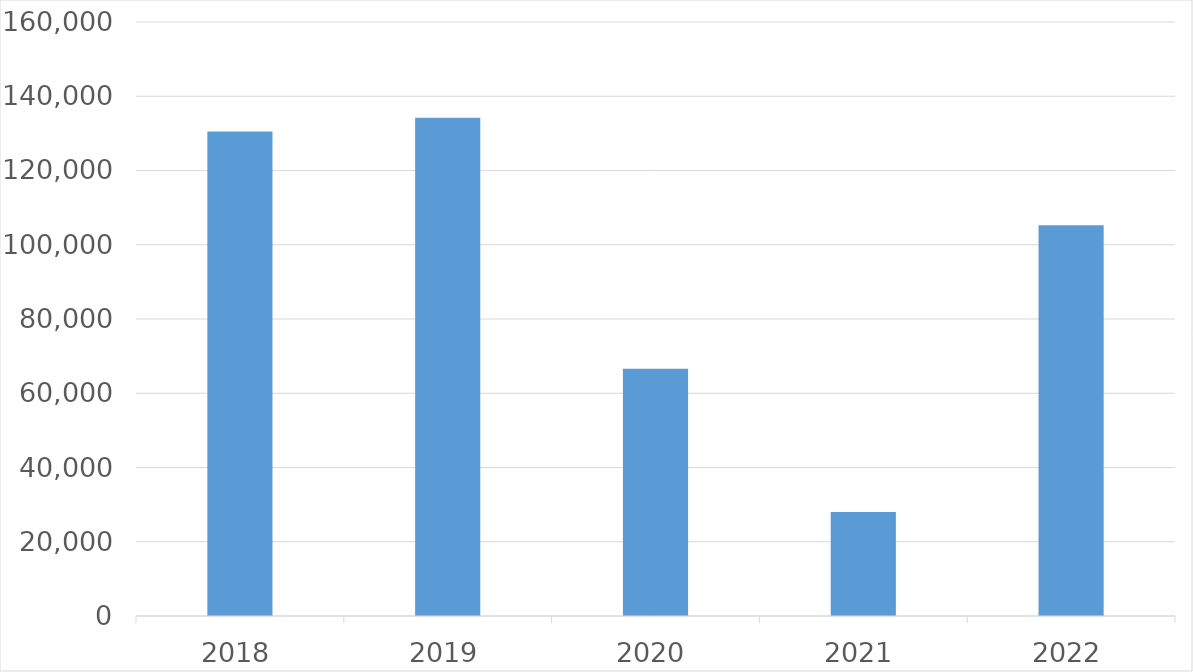
| Category | Series 0 |
|---|---|
| 2018 | 130515 |
| 2019 | 134200 |
| 2020 | 66586 |
| 2021 | 28043 |
| 2022 | 105285 |